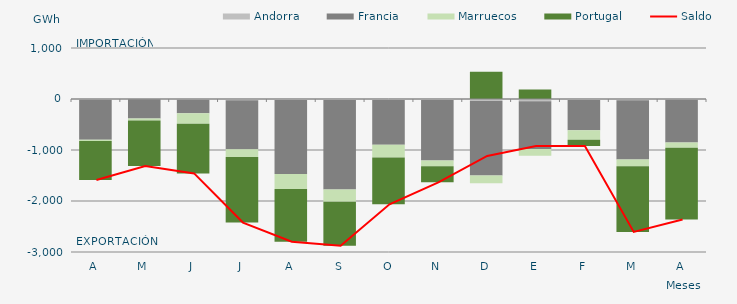
| Category | Andorra | Francia | Marruecos | Portugal |
|---|---|---|---|---|
| A | -16.536 | -782.914 | -22.588 | -764.832 |
| M | -5.354 | -378.96 | -37.987 | -891.537 |
| J | -16.539 | -262.937 | -205.078 | -974.176 |
| J | -22.256 | -963.789 | -152.863 | -1283.78 |
| A | -20.355 | -1451.936 | -291.598 | -1034.215 |
| S | -19.779 | -1752.3 | -243.405 | -861.179 |
| O | -20.359 | -877.448 | -247.178 | -920.502 |
| N | -20.176 | -1184.993 | -114.159 | -314.568 |
| D | -39.88 | -1462.427 | -149.967 | 535.045 |
| E | -42.454 | -936.901 | -131.692 | 188.334 |
| F | -21.206 | -592.499 | -187.112 | -122.026 |
| M | -23.108 | -1163.333 | -133.704 | -1286.701 |
| A | -14.627 | -836.505 | -105.478 | -1404.431 |